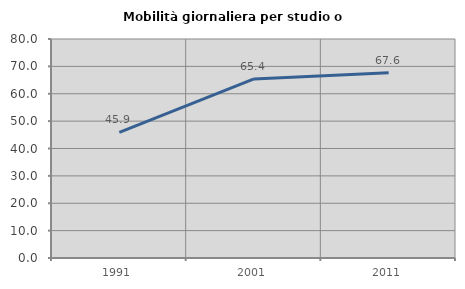
| Category | Mobilità giornaliera per studio o lavoro |
|---|---|
| 1991.0 | 45.918 |
| 2001.0 | 65.432 |
| 2011.0 | 67.636 |